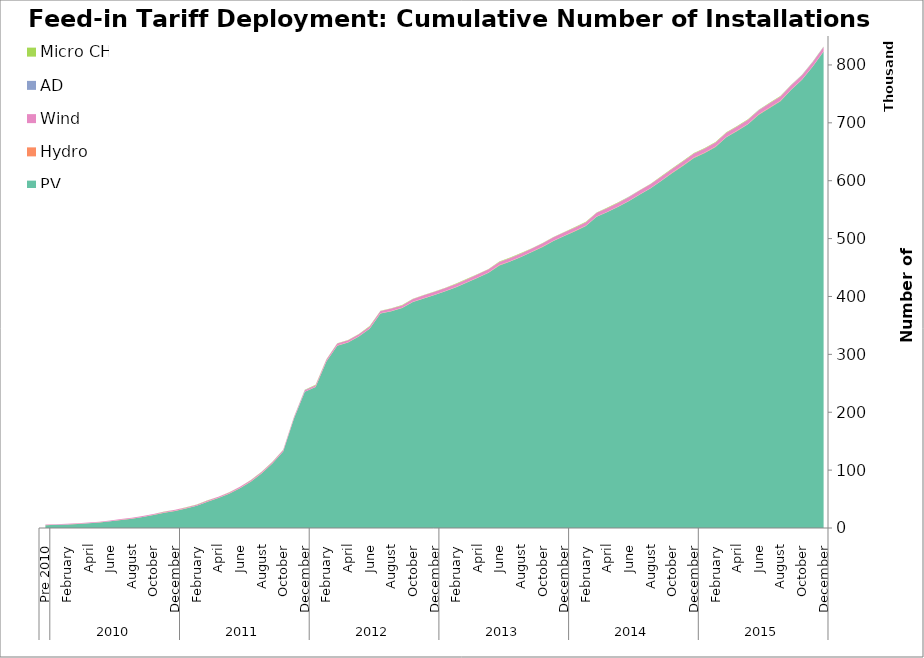
| Category | PV | Hydro | Wind | AD | Micro CHP |
|---|---|---|---|---|---|
| 0 | 4834 | 152 | 961 | 2 | 0 |
| 1 | 5471 | 153 | 984 | 2 | 0 |
| 2 | 6048 | 166 | 1019 | 2 | 0 |
| 3 | 7071 | 187 | 1073 | 3 | 0 |
| 4 | 8122 | 188 | 1110 | 3 | 0 |
| 5 | 9642 | 189 | 1160 | 3 | 0 |
| 6 | 11557 | 190 | 1213 | 4 | 6 |
| 7 | 13874 | 193 | 1270 | 5 | 16 |
| 8 | 16152 | 195 | 1324 | 7 | 25 |
| 9 | 19015 | 199 | 1381 | 8 | 38 |
| 10 | 22491 | 209 | 1463 | 8 | 56 |
| 11 | 26500 | 213 | 1542 | 8 | 92 |
| 12 | 29582 | 214 | 1585 | 8 | 125 |
| 13 | 33729 | 221 | 1640 | 11 | 152 |
| 14 | 38410 | 223 | 1697 | 11 | 196 |
| 15 | 45477 | 228 | 1788 | 14 | 241 |
| 16 | 51814 | 239 | 1860 | 15 | 266 |
| 17 | 59143 | 252 | 1949 | 18 | 293 |
| 18 | 68678 | 257 | 2153 | 19 | 312 |
| 19 | 79958 | 261 | 2216 | 19 | 332 |
| 20 | 94116 | 269 | 2286 | 21 | 357 |
| 21 | 111547 | 285 | 2380 | 21 | 399 |
| 22 | 132028 | 294 | 2457 | 22 | 428 |
| 23 | 189053 | 305 | 2537 | 23 | 444 |
| 24 | 235261 | 314 | 2620 | 26 | 456 |
| 25 | 243730 | 323 | 2752 | 28 | 461 |
| 26 | 287747 | 342 | 2909 | 28 | 466 |
| 27 | 314853 | 359 | 3347 | 28 | 476 |
| 28 | 320375 | 367 | 3419 | 30 | 484 |
| 29 | 330900 | 379 | 3535 | 34 | 496 |
| 30 | 344168 | 392 | 3680 | 38 | 513 |
| 31 | 370735 | 402 | 3806 | 43 | 519 |
| 32 | 374652 | 402 | 3972 | 45 | 522 |
| 33 | 379918 | 413 | 4178 | 51 | 532 |
| 34 | 390641 | 423 | 4419 | 55 | 547 |
| 35 | 396430 | 435 | 5184 | 61 | 561 |
| 36 | 402497 | 451 | 5203 | 64 | 569 |
| 37 | 408939 | 452 | 5238 | 67 | 580 |
| 38 | 415894 | 460 | 5306 | 69 | 584 |
| 39 | 423982 | 465 | 5352 | 70 | 587 |
| 40 | 432424 | 472 | 5375 | 72 | 592 |
| 41 | 440974 | 484 | 5417 | 72 | 592 |
| 42 | 453696 | 487 | 5456 | 77 | 593 |
| 43 | 460459 | 491 | 5494 | 80 | 594 |
| 44 | 468321 | 495 | 5528 | 85 | 594 |
| 45 | 476682 | 505 | 5605 | 88 | 594 |
| 46 | 485667 | 513 | 5664 | 92 | 596 |
| 47 | 495915 | 534 | 5733 | 98 | 600 |
| 48 | 504533 | 545 | 5800 | 106 | 603 |
| 49 | 512790 | 554 | 5850 | 108 | 608 |
| 50 | 521812 | 562 | 5937 | 112 | 610 |
| 51 | 537558 | 579 | 6394 | 121 | 615 |
| 52 | 545782 | 583 | 6414 | 122 | 615 |
| 53 | 554816 | 591 | 6446 | 124 | 615 |
| 54 | 564933 | 595 | 6485 | 128 | 615 |
| 55 | 576178 | 604 | 6518 | 130 | 617 |
| 56 | 586970 | 616 | 6558 | 139 | 619 |
| 57 | 599878 | 628 | 6666 | 154 | 621 |
| 58 | 613319 | 643 | 6714 | 162 | 625 |
| 59 | 626040 | 659 | 6778 | 187 | 628 |
| 60 | 639397 | 670 | 6917 | 212 | 629 |
| 61 | 647901 | 681 | 6919 | 213 | 636 |
| 62 | 658358 | 689 | 6934 | 214 | 643 |
| 63 | 674960 | 703 | 7035 | 225 | 644 |
| 64 | 685879 | 707 | 7047 | 225 | 646 |
| 65 | 697454 | 714 | 7061 | 226 | 646 |
| 66 | 714117 | 721 | 7089 | 228 | 646 |
| 67 | 725777 | 729 | 7130 | 230 | 647 |
| 68 | 737415 | 743 | 7152 | 232 | 647 |
| 69 | 756995 | 745 | 7208 | 234 | 647 |
| 70 | 774221 | 745 | 7213 | 234 | 647 |
| 71 | 797115 | 745 | 7220 | 234 | 647 |
| 72 | 823032 | 745 | 7236 | 234 | 647 |